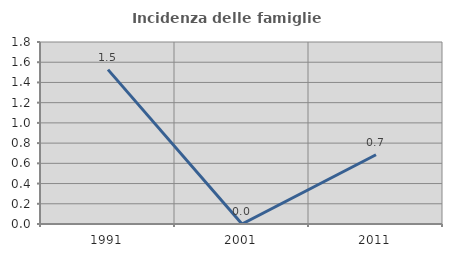
| Category | Incidenza delle famiglie numerose |
|---|---|
| 1991.0 | 1.527 |
| 2001.0 | 0 |
| 2011.0 | 0.685 |